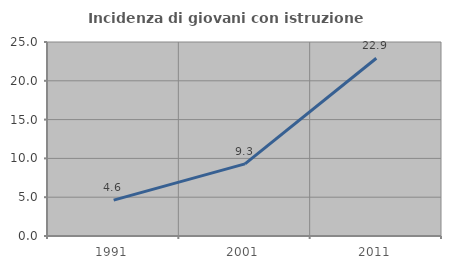
| Category | Incidenza di giovani con istruzione universitaria |
|---|---|
| 1991.0 | 4.623 |
| 2001.0 | 9.293 |
| 2011.0 | 22.906 |